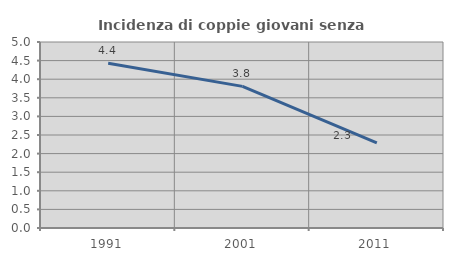
| Category | Incidenza di coppie giovani senza figli |
|---|---|
| 1991.0 | 4.431 |
| 2001.0 | 3.807 |
| 2011.0 | 2.288 |